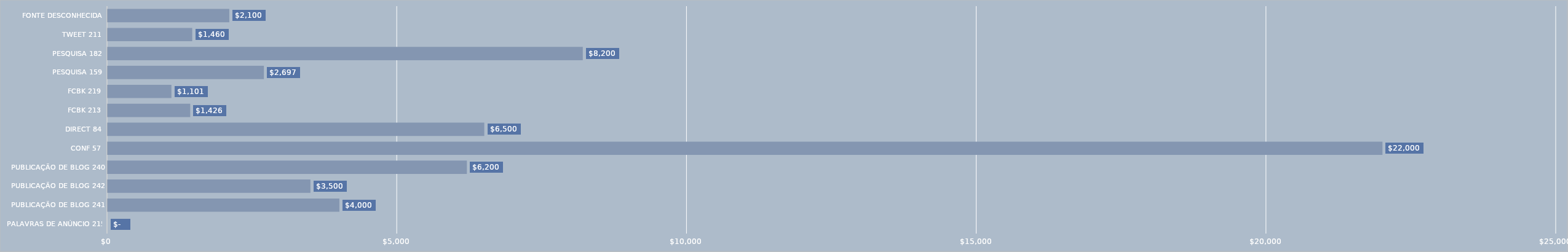
| Category | Series 0 |
|---|---|
| PALAVRAS DE ANÚNCIO 215 | 0 |
| PUBLICAÇÃO DE BLOG 241 | 4000 |
| PUBLICAÇÃO DE BLOG 242 | 3500 |
| PUBLICAÇÃO DE BLOG 240 | 6200 |
| CONF 57 | 22000 |
| DIRECT 84 | 6500 |
| FCBK 213 | 1426 |
| FCBK 219 | 1101 |
| PESQUISA 159 | 2697 |
| PESQUISA 182 | 8200 |
| TWEET 211 | 1460 |
| FONTE DESCONHECIDA | 2100 |